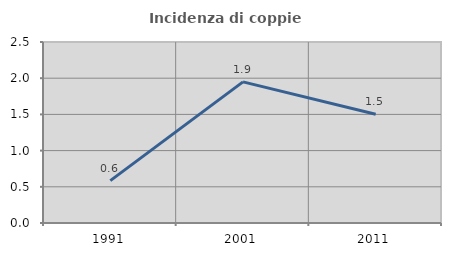
| Category | Incidenza di coppie miste |
|---|---|
| 1991.0 | 0.585 |
| 2001.0 | 1.949 |
| 2011.0 | 1.502 |